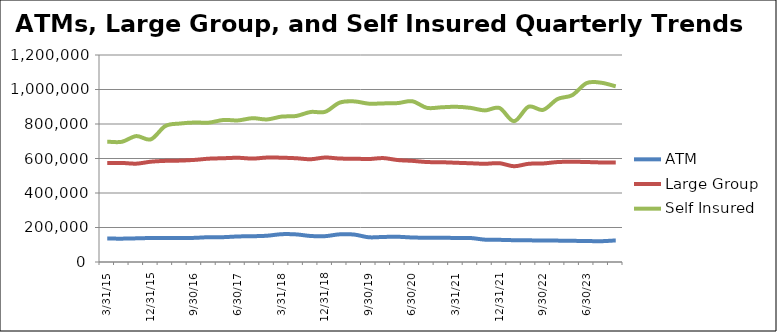
| Category | ATM | Large Group | Self Insured |
|---|---|---|---|
| 3/31/15 | 136077 | 573223 | 697664 |
| 6/30/15 | 135375 | 574283 | 696757 |
| 9/30/15 | 137077 | 570079 | 729906 |
| 12/31/15 | 139107 | 581409 | 711090 |
| 3/31/16 | 139345 | 586354 | 788327 |
| 6/30/16 | 139098 | 587772 | 802628 |
| 9/30/16 | 139938 | 591847 | 808674 |
| 12/31/16 | 143906 | 599048 | 807997 |
| 3/31/17 | 144034 | 601558 | 823389 |
| 6/30/17 | 148098 | 604204 | 820829 |
| 9/30/17 | 149404 | 599476 | 833638 |
| 12/31/17 | 152313 | 605456 | 826452 |
| 3/31/18 | 161230 | 604640 | 842940 |
| 6/30/18 | 160047 | 601559 | 846314 |
| 9/30/18 | 150757 | 595665 | 869730 |
| 12/31/18 | 149819 | 605713 | 870749 |
| 3/31/19 | 160385 | 599691 | 924005 |
| 6/30/19 | 159016 | 599096 | 931056 |
| 9/30/19 | 143265 | 596893 | 917920 |
| 12/31/19 | 145242 | 602394 | 919465 |
| 3/31/20 | 146182 | 590925 | 921215 |
| 6/30/20 | 142037 | 586300 | 931824 |
| 9/30/20 | 140627 | 579506 | 893632 |
| 12/31/20 | 141156 | 578427 | 896802 |
| 3/31/21 | 139093 | 575291 | 899834 |
| 6/30/21 | 139150 | 572379 | 893551 |
| 9/30/21 | 129543 | 569393 | 878748 |
| 12/31/21 | 128510 | 572703 | 892723 |
| 3/31/22 | 126356 | 555112 | 816287 |
| 6/30/22 | 125566 | 569307 | 900396 |
| 9/30/22 | 124670 | 571251 | 881814 |
| 12/31/22 | 123945 | 579457 | 944912 |
| 3/31/23 | 122806 | 581037 | 966876 |
| 6/30/23 | 121648 | 579569 | 1037338 |
| 9/30/23 | 120604 | 577063 | 1039286 |
| 12/31/23 | 125064 | 576720 | 1018284 |